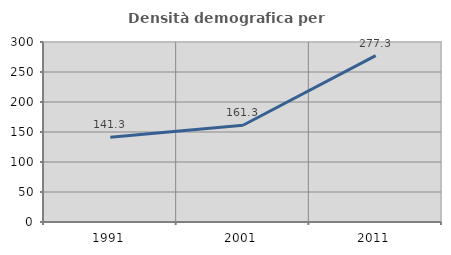
| Category | Densità demografica |
|---|---|
| 1991.0 | 141.337 |
| 2001.0 | 161.257 |
| 2011.0 | 277.303 |